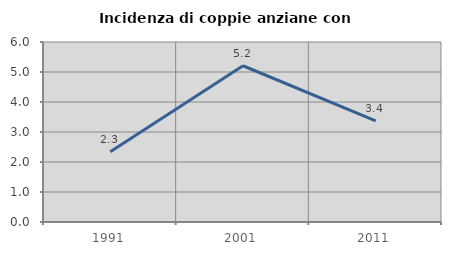
| Category | Incidenza di coppie anziane con figli |
|---|---|
| 1991.0 | 2.339 |
| 2001.0 | 5.208 |
| 2011.0 | 3.371 |